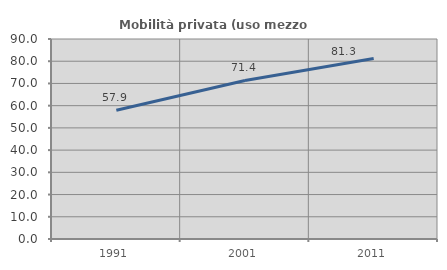
| Category | Mobilità privata (uso mezzo privato) |
|---|---|
| 1991.0 | 57.928 |
| 2001.0 | 71.352 |
| 2011.0 | 81.258 |